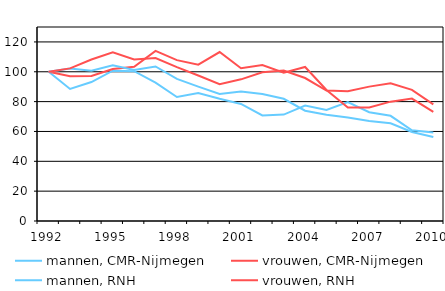
| Category | mannen, CMR-Nijmegen | vrouwen, CMR-Nijmegen | mannen, RNH | vrouwen, RNH |
|---|---|---|---|---|
| 1992.0 | 100 | 100 | 100 | 100 |
| 1993.0 | 88.488 | 97.011 | 102.113 | 102.268 |
| 1994.0 | 93.106 | 97.192 | 100.717 | 108.195 |
| 1995.0 | 100.703 | 101.855 | 104.285 | 113.057 |
| 1996.0 | 100.383 | 103.356 | 101.135 | 108.287 |
| 1997.0 | 92.669 | 113.966 | 103.53 | 109.2 |
| 1998.0 | 83.097 | 107.776 | 95.2 | 103.088 |
| 1999.0 | 85.746 | 104.714 | 90.069 | 97.472 |
| 2000.0 | 81.884 | 113.209 | 85.145 | 91.688 |
| 2001.0 | 78.416 | 102.362 | 86.756 | 94.931 |
| 2002.0 | 70.76 | 104.507 | 85.052 | 99.652 |
| 2003.0 | 71.309 | 99.303 | 81.877 | 100.819 |
| 2004.0 | 77.33 | 103.23 | 73.907 | 95.806 |
| 2005.0 | 74.354 | 87.81 | 71.258 | 87.388 |
| 2006.0 | 79.711 | 76.004 | 69.37 | 86.988 |
| 2007.0 | 72.873 | 76.066 | 66.968 | 90.04 |
| 2008.0 | 70.489 | 79.983 | 65.469 | 92.26 |
| 2009.0 | 60.774 | 82.021 | 59.673 | 87.88 |
| 2010.0 | 59.245 | 73.154 | 56.287 | 78.163 |